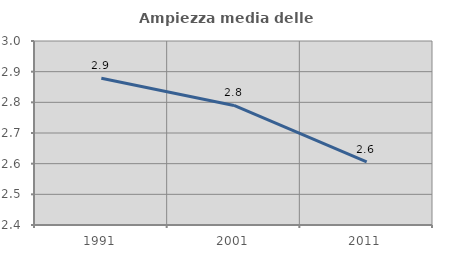
| Category | Ampiezza media delle famiglie |
|---|---|
| 1991.0 | 2.879 |
| 2001.0 | 2.79 |
| 2011.0 | 2.606 |